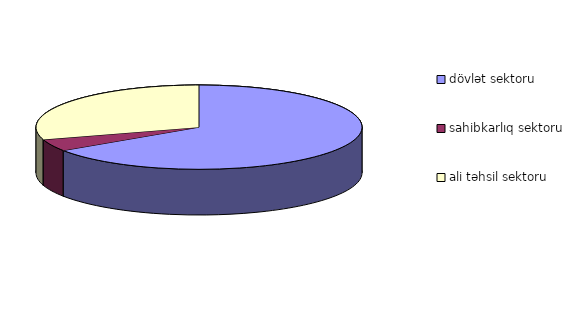
| Category | Series 0 |
|---|---|
| dövlət sektoru | 86 |
| sahibkarlıq sektoru | 6 |
| ali təhsil sektoru | 39 |